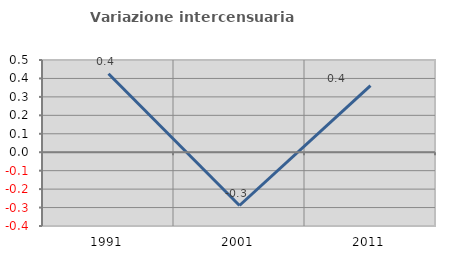
| Category | Variazione intercensuaria annua |
|---|---|
| 1991.0 | 0.426 |
| 2001.0 | -0.289 |
| 2011.0 | 0.361 |